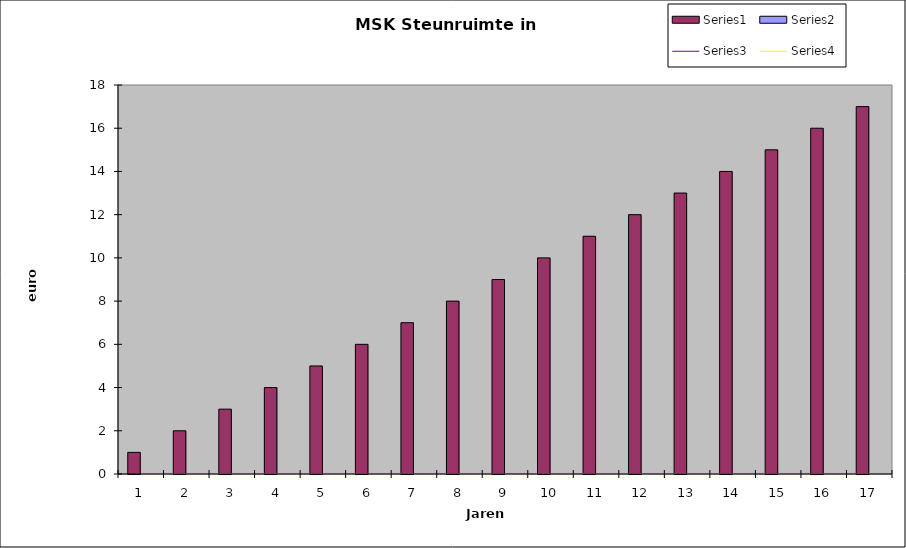
| Category | Series 0 | Series 1 |
|---|---|---|
| 0 | 1 | 0 |
| 1 | 2 | 0 |
| 2 | 3 | 0 |
| 3 | 4 | 0 |
| 4 | 5 | 0 |
| 5 | 6 | 0 |
| 6 | 7 | 0 |
| 7 | 8 | 0 |
| 8 | 9 | 0 |
| 9 | 10 | 0 |
| 10 | 11 | 0 |
| 11 | 12 | 0 |
| 12 | 13 | 0 |
| 13 | 14 | 0 |
| 14 | 15 | 0 |
| 15 | 16 | 0 |
| 16 | 17 | 0 |